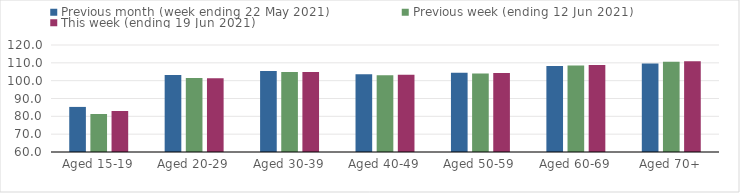
| Category | Previous month (week ending 22 May 2021) | Previous week (ending 12 Jun 2021) | This week (ending 19 Jun 2021) |
|---|---|---|---|
| Aged 15-19 | 85.28 | 81.3 | 82.98 |
| Aged 20-29 | 103.16 | 101.44 | 101.42 |
| Aged 30-39 | 105.44 | 104.88 | 104.86 |
| Aged 40-49 | 103.63 | 103.05 | 103.25 |
| Aged 50-59 | 104.45 | 104.07 | 104.25 |
| Aged 60-69 | 108.27 | 108.57 | 108.74 |
| Aged 70+ | 109.67 | 110.64 | 110.86 |